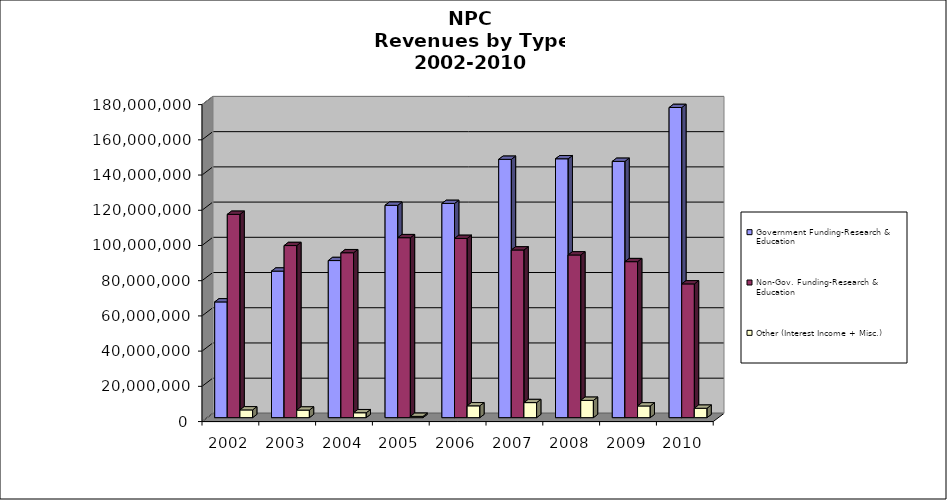
| Category | Government Funding-Research & Education | Non-Gov. Funding-Research & Education | Other (Interest Income + Misc.) |
|---|---|---|---|
| 2002.0 | 65716586 | 115455096 | 4391062 |
| 2003.0 | 83220692 | 97723742 | 4286506 |
| 2004.0 | 89204902 | 93644015 | 2780705 |
| 2005.0 | 120596382 | 102188172 | 726664 |
| 2006.0 | 121634811 | 101772305 | 6699575 |
| 2007.0 | 146703688 | 95214347 | 8535948 |
| 2008.0 | 147007995 | 92387989 | 9824748 |
| 2009.0 | 145540148 | 88574469 | 6631115 |
| 2010.0 | 176125412 | 75949271 | 5334340 |